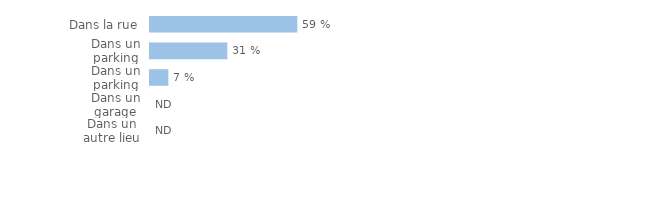
| Category | Series 2 |
|---|---|
| Dans un autre lieu | 0 |
| Dans un garage | 0 |
| Dans un parking fermé | 0.074 |
| Dans un parking ouvert | 0.312 |
| Dans la rue | 0.595 |